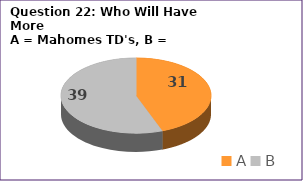
| Category | Series 0 |
|---|---|
| A | 31 |
| B | 39 |